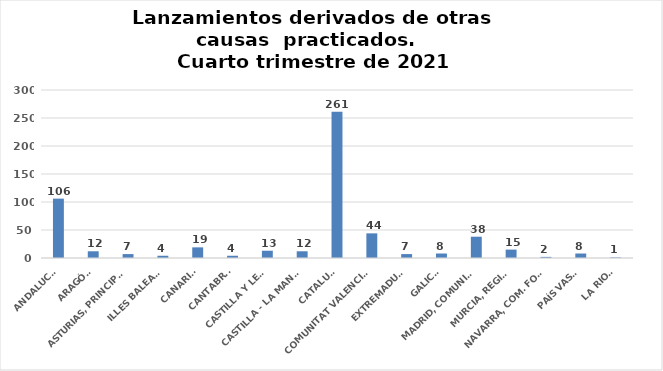
| Category | Series 0 |
|---|---|
| ANDALUCÍA | 106 |
| ARAGÓN | 12 |
| ASTURIAS, PRINCIPADO | 7 |
| ILLES BALEARS | 4 |
| CANARIAS | 19 |
| CANTABRIA | 4 |
| CASTILLA Y LEÓN | 13 |
| CASTILLA - LA MANCHA | 12 |
| CATALUÑA | 261 |
| COMUNITAT VALENCIANA | 44 |
| EXTREMADURA | 7 |
| GALICIA | 8 |
| MADRID, COMUNIDAD | 38 |
| MURCIA, REGIÓN | 15 |
| NAVARRA, COM. FORAL | 2 |
| PAÍS VASCO | 8 |
| LA RIOJA | 1 |